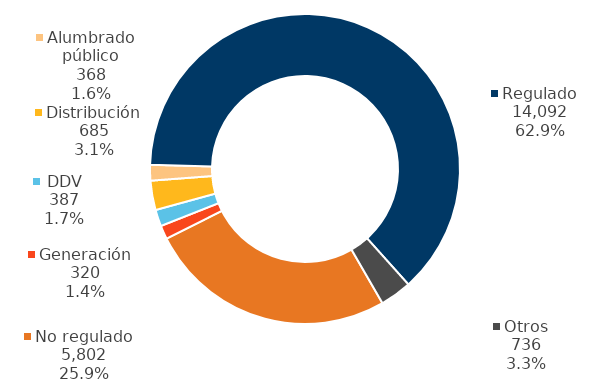
| Category | 2019-12-01 |
|---|---|
| No regulado | 5802 |
| Generación | 320 |
| DDV | 387 |
| Distribución | 685 |
| Alumbrado público | 368 |
| Regulado | 14092 |
| Otros | 736 |